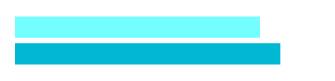
| Category | Actual Spend | Budgeted |
|---|---|---|
| 0 | 1300 | 1200 |